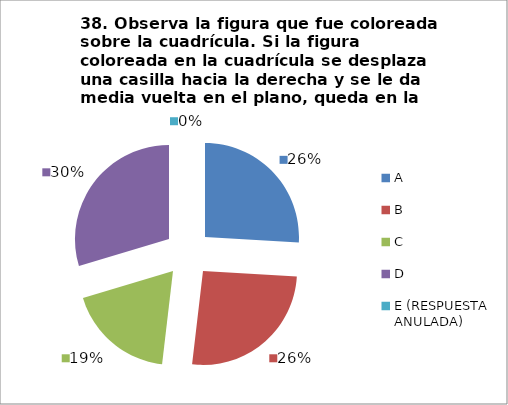
| Category | CANTIDAD DE RESPUESTAS PREGUNTA (38) | PORCENTAJE |
|---|---|---|
| A | 7 | 0.259 |
| B | 7 | 0.259 |
| C | 5 | 0.185 |
| D | 8 | 0.296 |
| E (RESPUESTA ANULADA) | 0 | 0 |